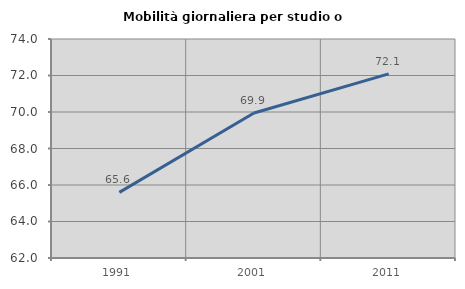
| Category | Mobilità giornaliera per studio o lavoro |
|---|---|
| 1991.0 | 65.596 |
| 2001.0 | 69.947 |
| 2011.0 | 72.089 |